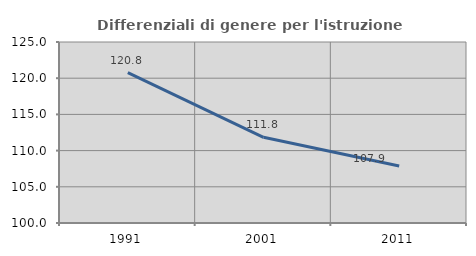
| Category | Differenziali di genere per l'istruzione superiore |
|---|---|
| 1991.0 | 120.777 |
| 2001.0 | 111.832 |
| 2011.0 | 107.88 |